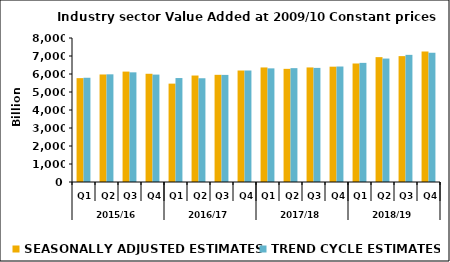
| Category | SEASONALLY ADJUSTED ESTIMATES | TREND CYCLE ESTIMATES |
|---|---|---|
| 0 | 5770.151 | 5790.937 |
| 1 | 5973.374 | 5982.095 |
| 2 | 6133.49 | 6092.747 |
| 3 | 6012.301 | 5967.155 |
| 4 | 5464.771 | 5775.471 |
| 5 | 5914.946 | 5763.8 |
| 6 | 5954.097 | 5949.837 |
| 7 | 6193.621 | 6194.884 |
| 8 | 6363.673 | 6313.158 |
| 9 | 6286.497 | 6325.184 |
| 10 | 6364.35 | 6339.273 |
| 11 | 6406.663 | 6416.026 |
| 12 | 6583.272 | 6618.509 |
| 13 | 6936.456 | 6858.006 |
| 14 | 6992.88 | 7063.577 |
| 15 | 7244.713 | 7177.269 |